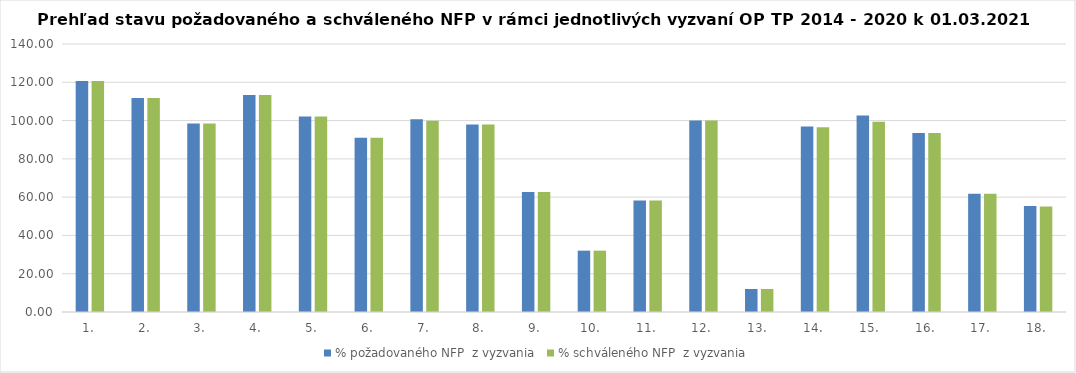
| Category | % požadovaného NFP  z vyzvania | % schváleného NFP  z vyzvania |
|---|---|---|
| 1. | 120.662 | 120.662 |
| 2. | 111.83 | 111.83 |
| 3. | 98.465 | 98.465 |
| 4. | 113.295 | 113.295 |
| 5. | 102.19 | 102.19 |
| 6. | 91.016 | 91.016 |
| 7. | 100.638 | 99.954 |
| 8. | 97.989 | 97.989 |
| 9. | 62.721 | 62.721 |
| 10. | 32.038 | 32.038 |
| 11. | 58.283 | 58.283 |
| 12. | 99.995 | 99.995 |
| 13. | 12.008 | 12.008 |
| 14. | 96.904 | 96.559 |
| 15. | 102.693 | 99.394 |
| 16. | 93.51 | 93.51 |
| 17. | 61.754 | 61.754 |
| 18. | 55.313 | 55.063 |